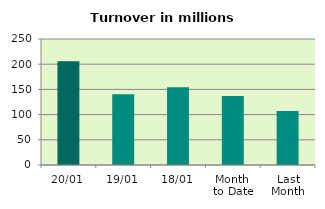
| Category | Series 0 |
|---|---|
| 20/01 | 205.864 |
| 19/01 | 140.387 |
| 18/01 | 154.323 |
| Month 
to Date | 136.744 |
| Last
Month | 107.094 |